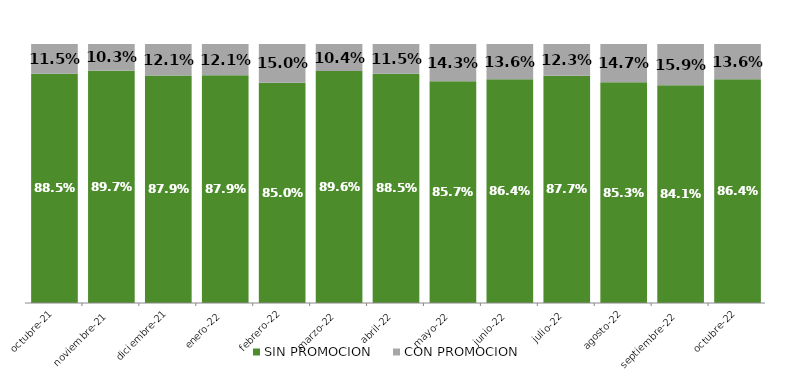
| Category | SIN PROMOCION   | CON PROMOCION   |
|---|---|---|
| 2021-10-01 | 0.885 | 0.115 |
| 2021-11-01 | 0.897 | 0.103 |
| 2021-12-01 | 0.879 | 0.121 |
| 2022-01-01 | 0.879 | 0.121 |
| 2022-02-01 | 0.85 | 0.15 |
| 2022-03-01 | 0.896 | 0.104 |
| 2022-04-01 | 0.885 | 0.115 |
| 2022-05-01 | 0.857 | 0.143 |
| 2022-06-01 | 0.864 | 0.136 |
| 2022-07-01 | 0.877 | 0.123 |
| 2022-08-01 | 0.853 | 0.147 |
| 2022-09-01 | 0.841 | 0.159 |
| 2022-10-01 | 0.864 | 0.136 |